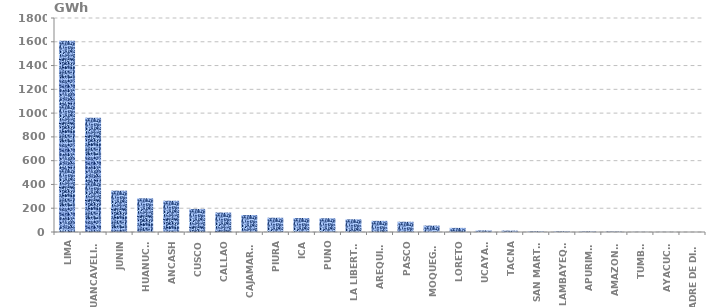
| Category | Series 0 |
|---|---|
| LIMA | 1609.017 |
| HUANCAVELICA | 960.425 |
| JUNIN | 347.86 |
| HUANUCO | 283.52 |
| ANCASH | 263.067 |
| CUSCO | 193.867 |
| CALLAO | 163.764 |
| CAJAMARCA | 143 |
| PIURA | 119.978 |
| ICA | 117.672 |
| PUNO | 115.764 |
| LA LIBERTAD | 106.949 |
| AREQUIPA | 93.796 |
| PASCO | 86.306 |
| MOQUEGUA | 53.932 |
| LORETO | 34.553 |
| UCAYALI | 13.251 |
| TACNA | 11.595 |
| SAN MARTÍN | 5.5 |
| LAMBAYEQUE | 5.249 |
| APURIMAC | 4.599 |
| AMAZONAS | 3.516 |
| TUMBES | 1.101 |
| AYACUCHO | 0.861 |
| MADRE DE DIOS | 0.178 |